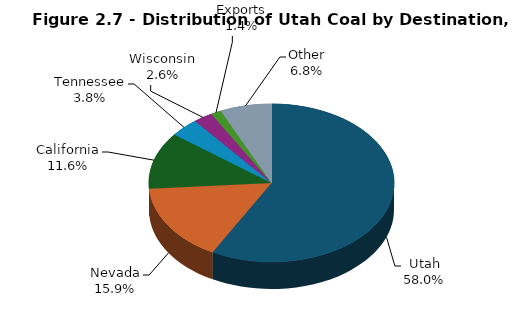
| Category | Series 0 |
|---|---|
| Utah | 13649 |
| Nevada | 3738 |
| California | 2739 |
| Tennessee | 902 |
| Wisconsin | 603 |
| Exports | 318 |
| Other | 1602 |